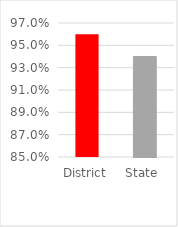
| Category | Series 0 |
|---|---|
| District | 0.96 |
| State  | 0.94 |